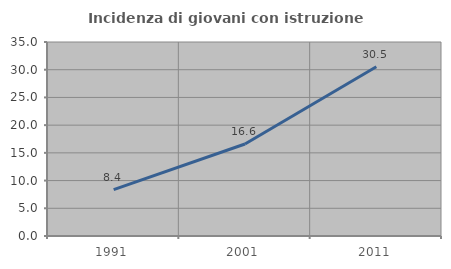
| Category | Incidenza di giovani con istruzione universitaria |
|---|---|
| 1991.0 | 8.37 |
| 2001.0 | 16.605 |
| 2011.0 | 30.543 |